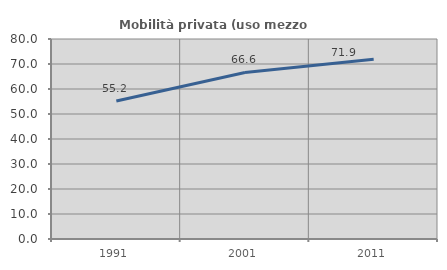
| Category | Mobilità privata (uso mezzo privato) |
|---|---|
| 1991.0 | 55.185 |
| 2001.0 | 66.609 |
| 2011.0 | 71.902 |